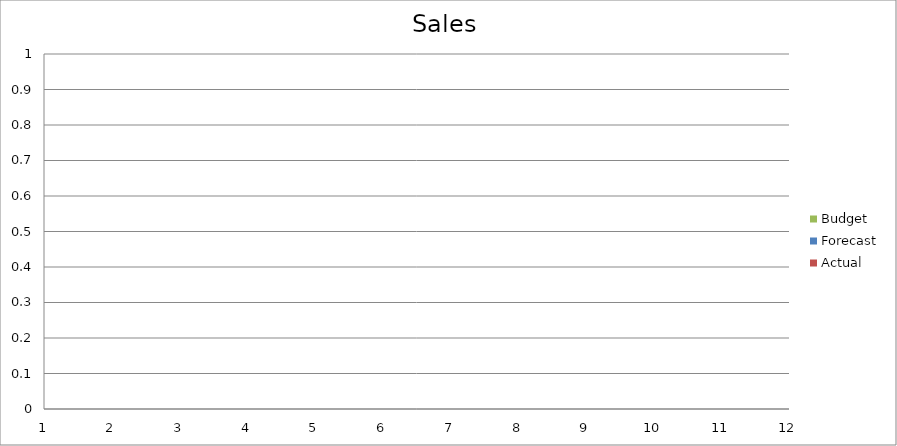
| Category | Budget | Forecast | Actual |
|---|---|---|---|
| 0 | 2620 | 1490 | 1960 |
| 1 | 1460 | 1670 | 2330 |
| 2 | 2410 | 1880 | 3110 |
| 3 | 1330 | 2140 | 2370 |
| 4 | 1420 | 1680 | 1710 |
| 5 | 2260 | 2350 | 3360 |
| 6 | 2440 | 1970 | 2940 |
| 7 | 1820 | 2430 | 1980 |
| 8 | 1690 | 1150 | 3400 |
| 9 | 1940 | 2830 | 2030 |
| 10 | 3190 | 3190 | 2770 |
| 11 | 3270 | 2040 | 540 |